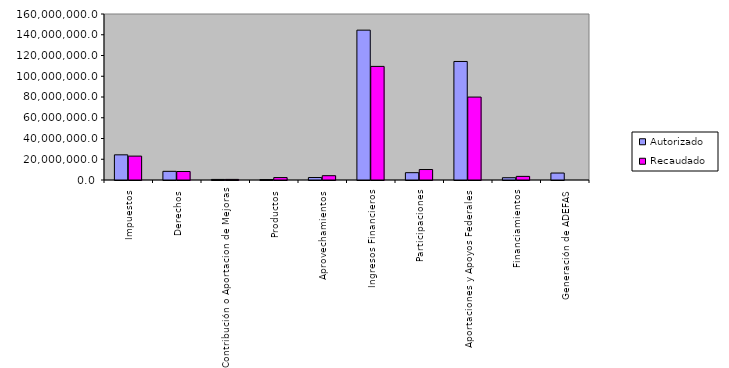
| Category | Autorizado | Recaudado |
|---|---|---|
| 0 | 24258736.4 | 23025577.7 |
| 1 | 8345615.3 | 8189969 |
| 2 | 549841.9 | 574108.7 |
| 3 | 412076.9 | 2346866.8 |
| 4 | 2392843.2 | 4150353.7 |
| 5 | 144435639 | 109493712.9 |
| 6 | 7052274.2 | 10092322.8 |
| 7 | 114241050.7 | 79938523.1 |
| 8 | 2195832.7 | 3491107.8 |
| 9 | 6709482.3 | 0 |